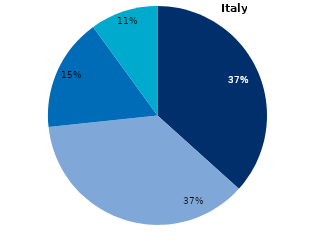
| Category | Series 0 |
|---|---|
| Public permissionless | 0.367 |
| Public permissioned | 0.367 |
| Private consortium | 0.167 |
| Private enterprise | 0.1 |